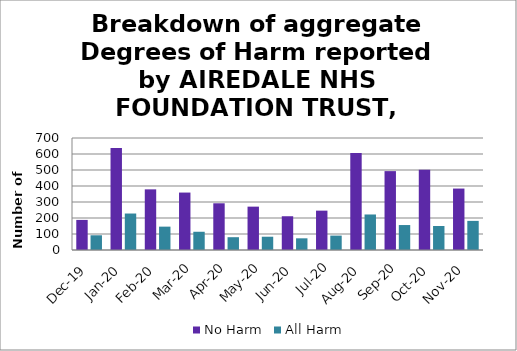
| Category | No Harm | All Harm |
|---|---|---|
| Dec-19 | 188 | 92 |
| Jan-20 | 637 | 228 |
| Feb-20 | 379 | 146 |
| Mar-20 | 359 | 114 |
| Apr-20 | 292 | 80 |
| May-20 | 271 | 83 |
| Jun-20 | 211 | 73 |
| Jul-20 | 246 | 90 |
| Aug-20 | 606 | 222 |
| Sep-20 | 493 | 156 |
| Oct-20 | 501 | 150 |
| Nov-20 | 384 | 182 |